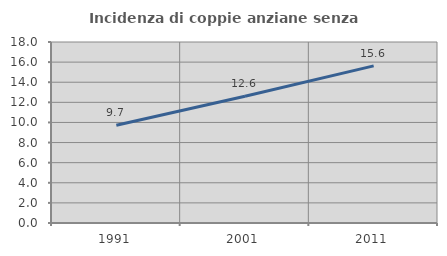
| Category | Incidenza di coppie anziane senza figli  |
|---|---|
| 1991.0 | 9.713 |
| 2001.0 | 12.606 |
| 2011.0 | 15.622 |